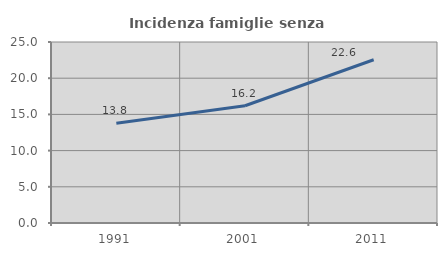
| Category | Incidenza famiglie senza nuclei |
|---|---|
| 1991.0 | 13.789 |
| 2001.0 | 16.192 |
| 2011.0 | 22.552 |